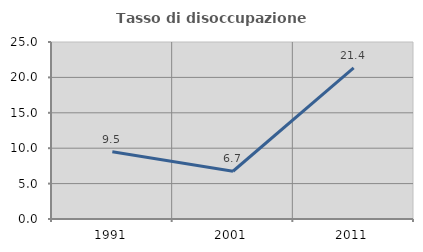
| Category | Tasso di disoccupazione giovanile  |
|---|---|
| 1991.0 | 9.512 |
| 2001.0 | 6.746 |
| 2011.0 | 21.359 |